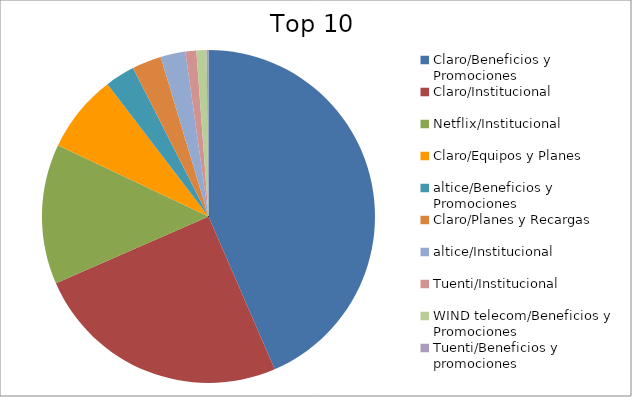
| Category | Series 0 |
|---|---|
| Claro/Beneficios y Promociones | 43.26 |
| Claro/Institucional | 24.82 |
| Netflix/Institucional | 13.52 |
| Claro/Equipos y Planes | 7.55 |
| altice/Beneficios y Promociones | 2.87 |
| Claro/Planes y Recargas | 2.84 |
| altice/Institucional | 2.4 |
| Tuenti/Institucional | 1.05 |
| WIND telecom/Beneficios y Promociones | 0.98 |
| Tuenti/Beneficios y promociones | 0.18 |